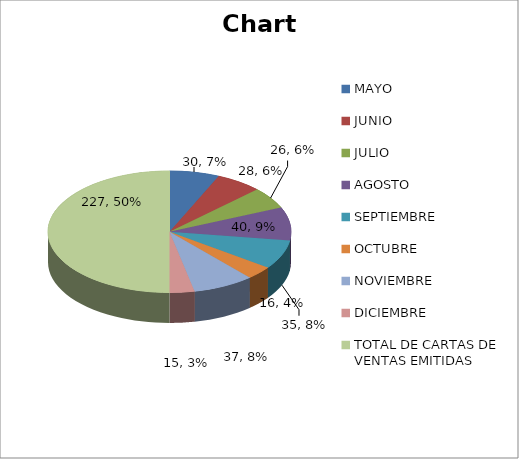
| Category | Series 0 |
|---|---|
| MAYO | 30 |
| JUNIO | 28 |
| JULIO | 26 |
| AGOSTO | 40 |
| SEPTIEMBRE | 35 |
| OCTUBRE | 16 |
| NOVIEMBRE | 37 |
| DICIEMBRE | 15 |
| TOTAL DE CARTAS DE VENTAS EMITIDAS   | 227 |